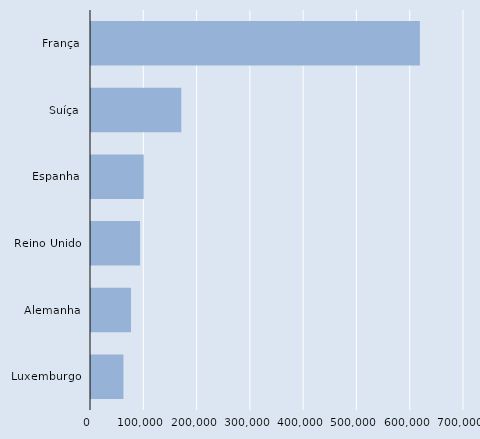
| Category | Series 0 |
|---|---|
| França | 617235 |
| Suíça | 169458 |
| Espanha | 98975 |
| Reino Unido | 92065 |
| Alemanha | 75110 |
| Luxemburgo | 60897 |